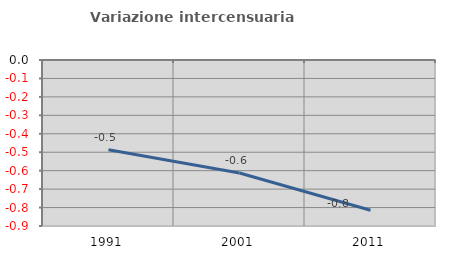
| Category | Variazione intercensuaria annua |
|---|---|
| 1991.0 | -0.487 |
| 2001.0 | -0.612 |
| 2011.0 | -0.815 |